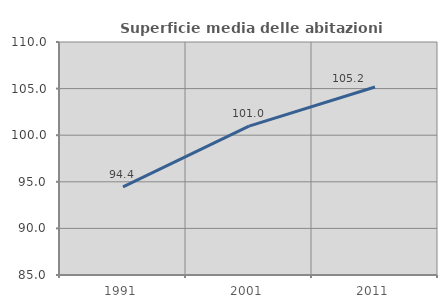
| Category | Superficie media delle abitazioni occupate |
|---|---|
| 1991.0 | 94.446 |
| 2001.0 | 100.97 |
| 2011.0 | 105.174 |